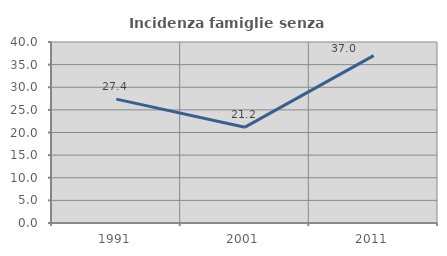
| Category | Incidenza famiglie senza nuclei |
|---|---|
| 1991.0 | 27.381 |
| 2001.0 | 21.176 |
| 2011.0 | 37 |